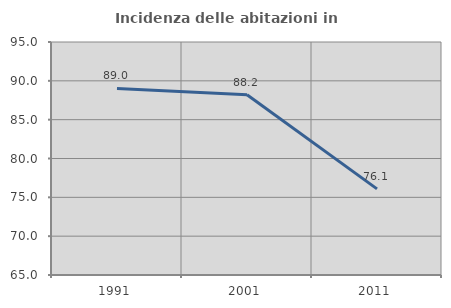
| Category | Incidenza delle abitazioni in proprietà  |
|---|---|
| 1991.0 | 89.028 |
| 2001.0 | 88.213 |
| 2011.0 | 76.087 |